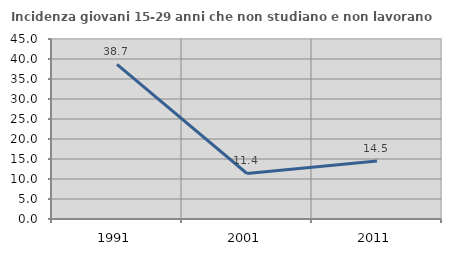
| Category | Incidenza giovani 15-29 anni che non studiano e non lavorano  |
|---|---|
| 1991.0 | 38.653 |
| 2001.0 | 11.376 |
| 2011.0 | 14.526 |